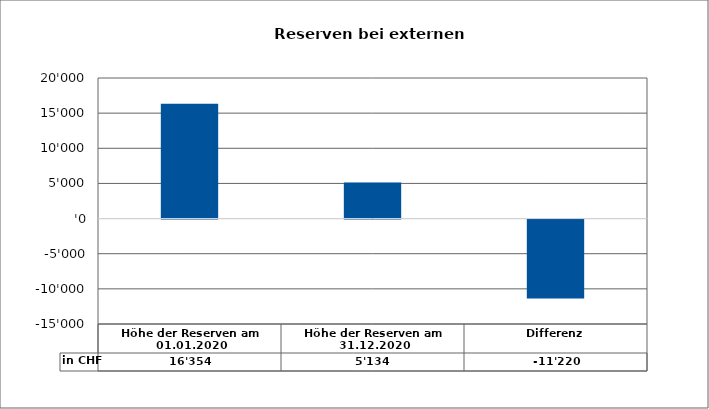
| Category | in CHF |
|---|---|
| Höhe der Reserven am 01.01.2020 | 16354 |
| Höhe der Reserven am 31.12.2020 | 5133.56 |
| Differenz | -11220.44 |